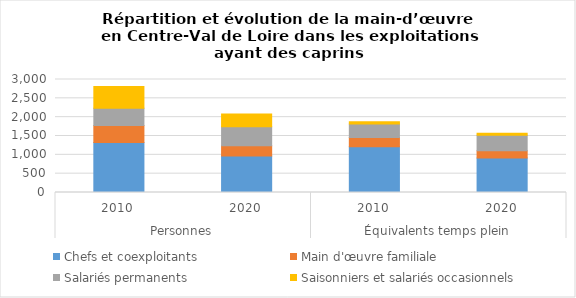
| Category | Chefs et coexploitants | Main d'œuvre familiale | Salariés permanents | Saisonniers et salariés occasionnels |
|---|---|---|---|---|
| 0 | 1327 | 455 | 452 | 579 |
| 1 | 971 | 272 | 503 | 338 |
| 2 | 1216 | 247 | 358.125 | 59.489 |
| 3 | 916.75 | 188.375 | 414 | 52.407 |